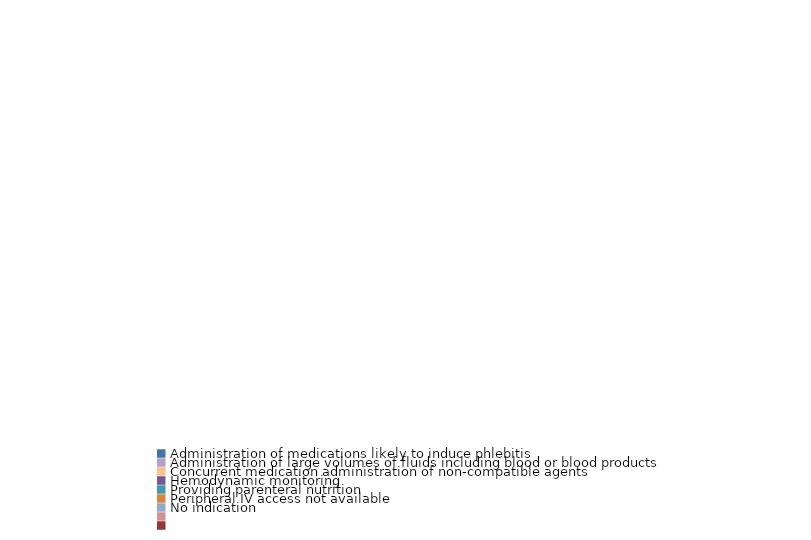
| Category | Series 0 |
|---|---|
| Administration of medications likely to induce phlebitis | 0 |
| Administration of large volumes of fluids including blood or blood products | 0 |
| Concurrent medication administration of non-compatible agents | 0 |
| Hemodynamic monitoring | 0 |
| Providing parenteral nutrition | 0 |
| Peripheral IV access not available | 0 |
| No indication | 0 |